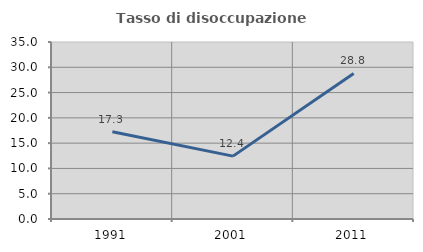
| Category | Tasso di disoccupazione giovanile  |
|---|---|
| 1991.0 | 17.256 |
| 2001.0 | 12.433 |
| 2011.0 | 28.788 |